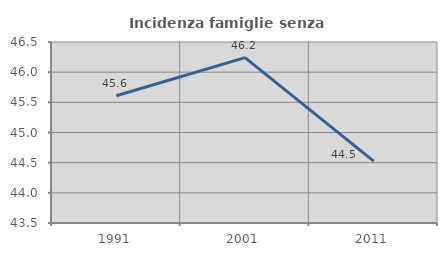
| Category | Incidenza famiglie senza nuclei |
|---|---|
| 1991.0 | 45.608 |
| 2001.0 | 46.241 |
| 2011.0 | 44.526 |